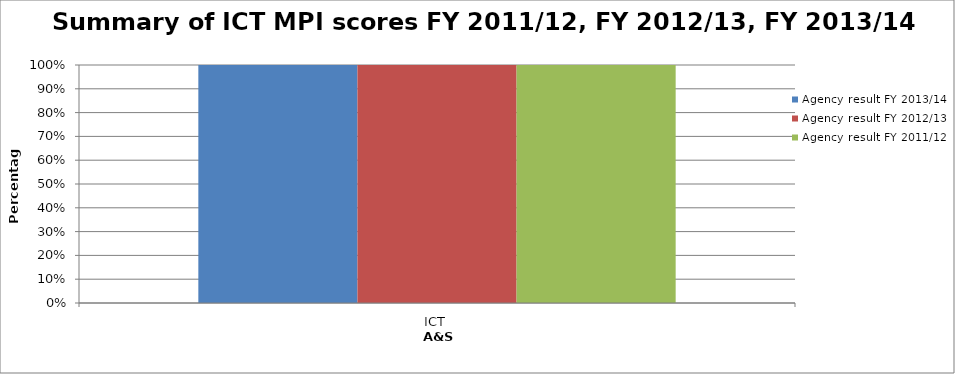
| Category | Agency result FY 2013/14  | Agency result FY 2012/13  | Agency result FY 2011/12  |
|---|---|---|---|
| ICT | 1 | 1 | 1 |